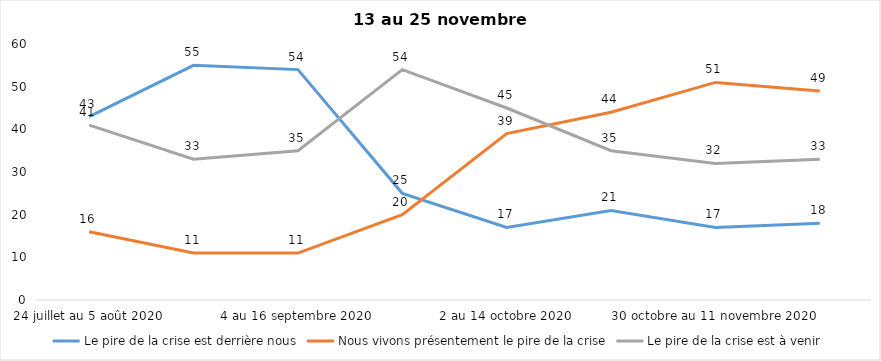
| Category | Le pire de la crise est derrière nous | Nous vivons présentement le pire de la crise | Le pire de la crise est à venir |
|---|---|---|---|
| 24 juillet au 5 août 2020 | 43 | 16 | 41 |
| 7 au 19 août 2020 | 55 | 11 | 33 |
| 4 au 16 septembre 2020 | 54 | 11 | 35 |
| 18 au 30 septembre 2020 | 25 | 20 | 54 |
| 2 au 14 octobre 2020 | 17 | 39 | 45 |
| 16 au 28 octobre 2020 | 21 | 44 | 35 |
| 30 octobre au 11 novembre 2020 | 17 | 51 | 32 |
| 13 au 25 novembre 2020 | 18 | 49 | 33 |